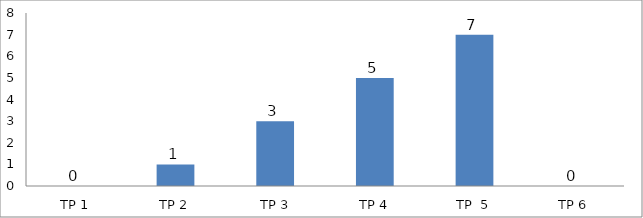
| Category | BIL. MURID |
|---|---|
| TP 1 | 0 |
| TP 2 | 1 |
|  TP 3 | 3 |
| TP 4 | 5 |
| TP  5 | 7 |
| TP 6 | 0 |